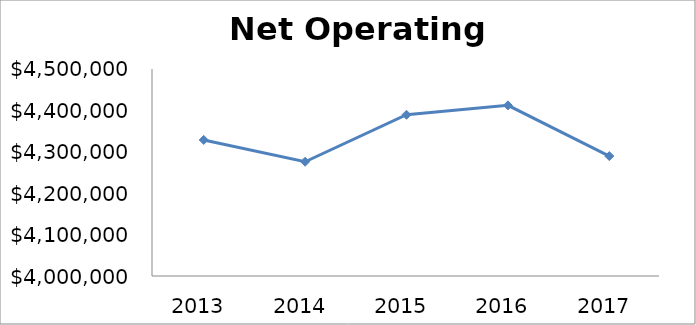
| Category | Series 0 |
|---|---|
| 2013.0 | 4328643 |
| 2014.0 | 4275983.414 |
| 2015.0 | 4389459.524 |
| 2016.0 | 4412158.111 |
| 2017.0 | 4289703.999 |